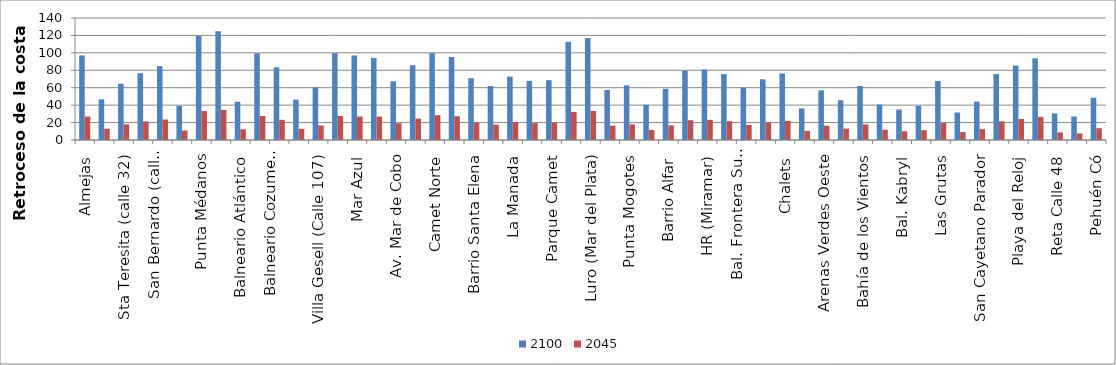
| Category | 2100 | 2045 |
|---|---|---|
| Almejas | 97.029 | 26.953 |
| Las Toninas | 46.652 | 12.959 |
| Sta Teresita (calle 32) | 64.61 | 17.947 |
| Mar del Tuyú (calle 58) | 76.652 | 21.292 |
| San Bernardo (calle Andrade) | 84.704 | 23.529 |
| Mar de Ajó | 39.15 | 10.875 |
| Punta Médanos | 119.388 | 33.163 |
| Pinamar Golf Club | 124.796 | 34.666 |
| Balneario Atlántico | 43.943 | 12.206 |
| La Pérgola (Valeria del Mar) | 99.424 | 27.618 |
| Balneario Cozumel (Cariló) | 83.412 | 23.17 |
| Villa Gesell (Calle 309) | 46.332 | 12.87 |
| Villa Gesell (Calle 107) | 60.292 | 16.748 |
| Balneario Soleado (Mar de las Pampas) | 99.635 | 27.676 |
| Mar Azul | 96.986 | 26.941 |
| Calle San Martín | 94.219 | 26.92 |
| Av. Mar de Cobo | 67.309 | 19.231 |
| Av. Del Parque (La Caleta) | 85.782 | 24.509 |
| Camet Norte | 99.623 | 28.464 |
| Santa Clara del Mar | 95.3 | 27.229 |
| Barrio Santa Elena | 70.92 | 20.263 |
| Playa Los Cantiles | 61.912 | 17.689 |
| La Manada | 72.731 | 20.78 |
| La Cloaca (Mar del Plata) | 67.821 | 19.378 |
| Parque Camet | 68.727 | 19.636 |
| Strobel (Mar del Plata) | 112.653 | 32.187 |
| Luro (Mar del Plata) | 116.972 | 33.421 |
| Playa Grande (Mar del Plata) | 57.471 | 16.42 |
| Punta Mogotes | 62.723 | 17.921 |
| Honu Beach | 40.413 | 11.547 |
| Barrio Alfar | 58.782 | 16.795 |
| Chapadmalal | 79.547 | 22.728 |
| HR (Miramar) | 80.939 | 23.126 |
| Monolito (Miramar) | 75.674 | 21.621 |
| Bal. Frontera Sur (Miramar) | 60.164 | 17.19 |
| Bal. Cocoloco | 69.668 | 19.905 |
| Chalets | 76.351 | 21.815 |
| Centinela del Mar | 36.221 | 10.427 |
| Arenas Verdes Oeste | 57.006 | 16.411 |
| Costa Bonita | 45.599 | 13.127 |
| Bahía de los Vientos | 62.025 | 17.856 |
| Av. 75 Necochea | 40.772 | 11.737 |
| Bal. Kabryl | 34.921 | 10.053 |
| Médano Blanco | 39.288 | 11.31 |
| Las Grutas | 67.723 | 19.496 |
| Bal. Los Angeles | 31.548 | 9.082 |
| San Cayetano Parador | 43.995 | 12.476 |
| Orense | 75.637 | 21.449 |
| Playa del Reloj | 85.446 | 24.231 |
| Bal. Barlovento (Dunamar) | 93.666 | 26.562 |
| Reta Calle 48 | 30.568 | 8.668 |
| Faro Recalada | 26.978 | 7.538 |
| Pehuén Có | 48.482 | 13.546 |